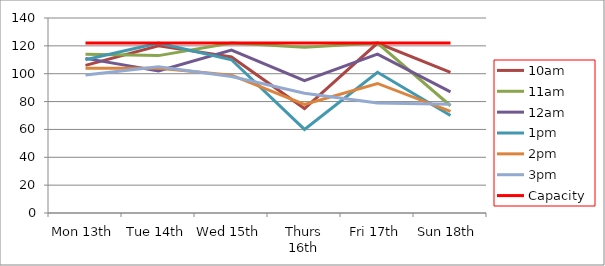
| Category | 9am | 10am | 11am | 12am | 1pm | 2pm | 3pm | 4pm | 5pm | Capacity |
|---|---|---|---|---|---|---|---|---|---|---|
| Mon 13th |  | 106 | 114 | 111 | 110 | 104 | 99 |  |  | 122 |
| Tue 14th |  | 120 | 113 | 102 | 122 | 104 | 105 |  |  | 122 |
| Wed 15th |  | 112 | 122 | 117 | 110 | 99 | 98 |  |  | 122 |
| Thurs 16th |  | 75 | 119 | 95 | 60 | 78 | 86 |  |  | 122 |
| Fri 17th |  | 122 | 122 | 114 | 101 | 93 | 79 |  |  | 122 |
| Sun 18th |  | 101 | 77 | 87 | 70 | 73 | 78 |  |  | 122 |